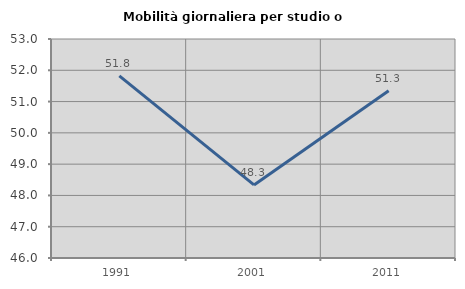
| Category | Mobilità giornaliera per studio o lavoro |
|---|---|
| 1991.0 | 51.821 |
| 2001.0 | 48.335 |
| 2011.0 | 51.345 |